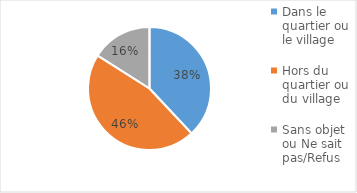
| Category | Series 0 |
|---|---|
| Dans le quartier ou le village | 0.38 |
| Hors du quartier ou du village | 0.46 |
| Sans objet ou Ne sait pas/Refus | 0.16 |